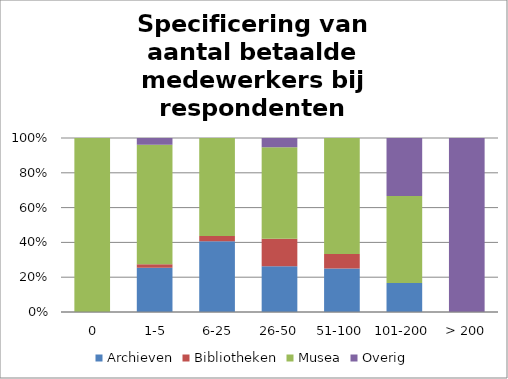
| Category | Archieven | Bibliotheken | Musea | Overig |
|---|---|---|---|---|
|  0 | 0 | 0 | 10 | 0 |
|  1-5 | 13 | 1 | 35 | 2 |
|  6-25 | 13 | 1 | 18 | 0 |
| 26-50 | 5 | 3 | 10 | 1 |
| 51-100 | 3 | 1 | 8 | 0 |
| 101-200 | 1 | 0 | 3 | 2 |
| > 200 | 0 | 0 | 0 | 1 |